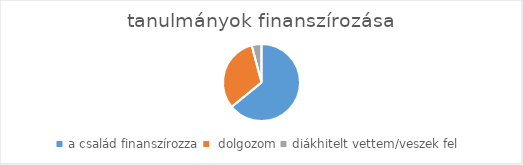
| Category | Series 0 |
|---|---|
| a család finanszírozza | 327 |
|  dolgozom | 162 |
| diákhitelt vettem/veszek fel | 21 |